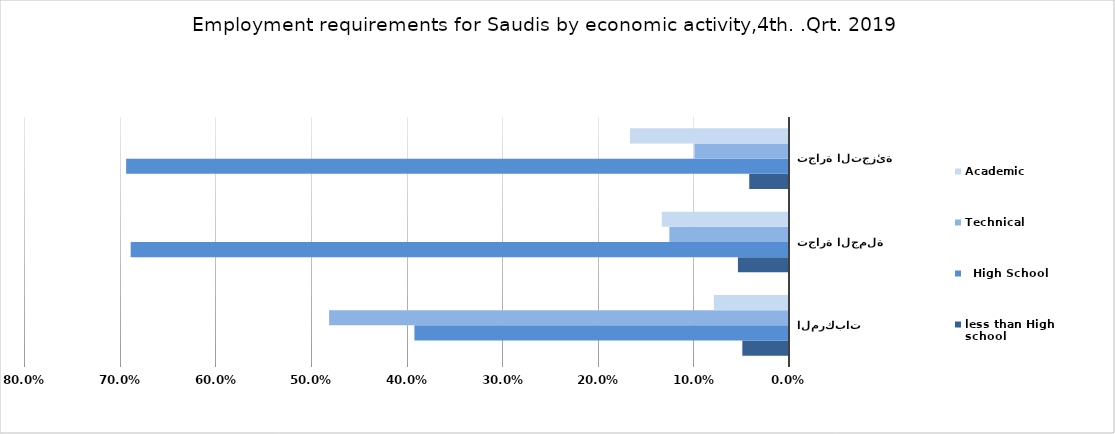
| Category | less than High school |   High School | Technical | Academic |
|---|---|---|---|---|
| بيع وإصلاح المركبات  | 0.049 | 0.392 | 0.481 | 0.079 |
| تجارة الجملة | 0.053 | 0.688 | 0.125 | 0.133 |
| تجارة التجزئة | 0.042 | 0.693 | 0.099 | 0.166 |